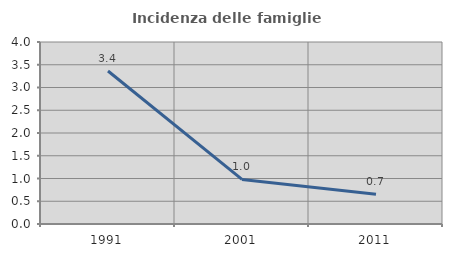
| Category | Incidenza delle famiglie numerose |
|---|---|
| 1991.0 | 3.363 |
| 2001.0 | 0.98 |
| 2011.0 | 0.653 |